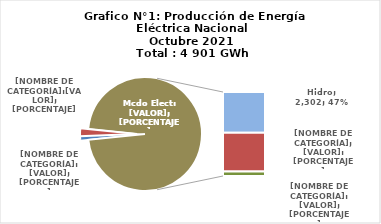
| Category | Series 0 |
|---|---|
| 0 | 49.53 |
| 1 | 110.245 |
| 2 | 2302.287 |
| 3 | 2184.04 |
| 4 | 255.384 |